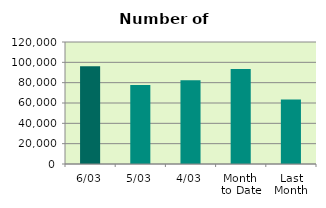
| Category | Series 0 |
|---|---|
| 6/03 | 96160 |
| 5/03 | 77700 |
| 4/03 | 82366 |
| Month 
to Date | 93333.2 |
| Last
Month | 63353.4 |